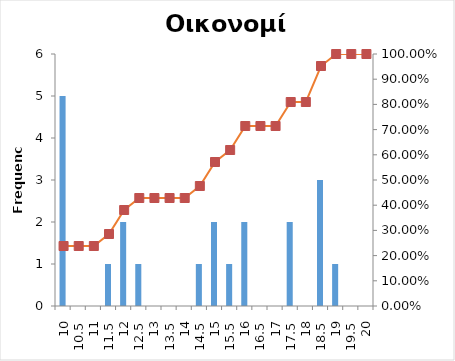
| Category | Series 0 |
|---|---|
| 10 | 5 |
| 10,5 | 0 |
| 11 | 0 |
| 11,5 | 1 |
| 12 | 2 |
| 12,5 | 1 |
| 13 | 0 |
| 13,5 | 0 |
| 14 | 0 |
| 14,5 | 1 |
| 15 | 2 |
| 15,5 | 1 |
| 16 | 2 |
| 16,5 | 0 |
| 17 | 0 |
| 17,5 | 2 |
| 18 | 0 |
| 18,5 | 3 |
| 19 | 1 |
| 19,5 | 0 |
| 20 | 0 |